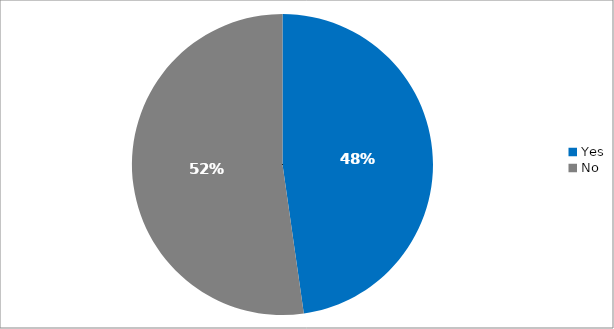
| Category | Responses |
|---|---|
| Yes | 0.477 |
| No | 0.523 |